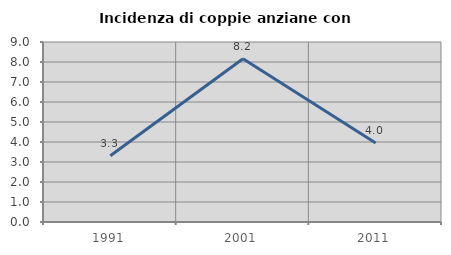
| Category | Incidenza di coppie anziane con figli |
|---|---|
| 1991.0 | 3.31 |
| 2001.0 | 8.163 |
| 2011.0 | 3.953 |